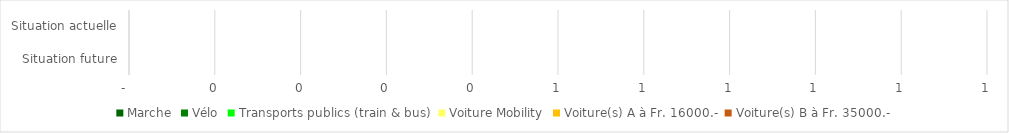
| Category | Marche | Vélo | Transports publics (train & bus) | Voiture Mobility | Voiture(s) A à Fr. 16000.- | Voiture(s) B à Fr. 35000.- |
|---|---|---|---|---|---|---|
| Situation future | 0 | 0 | 0 | 0 | 0 | 0 |
| Situation actuelle | 0 | 0 | 0 | 0 | 0 | 0 |